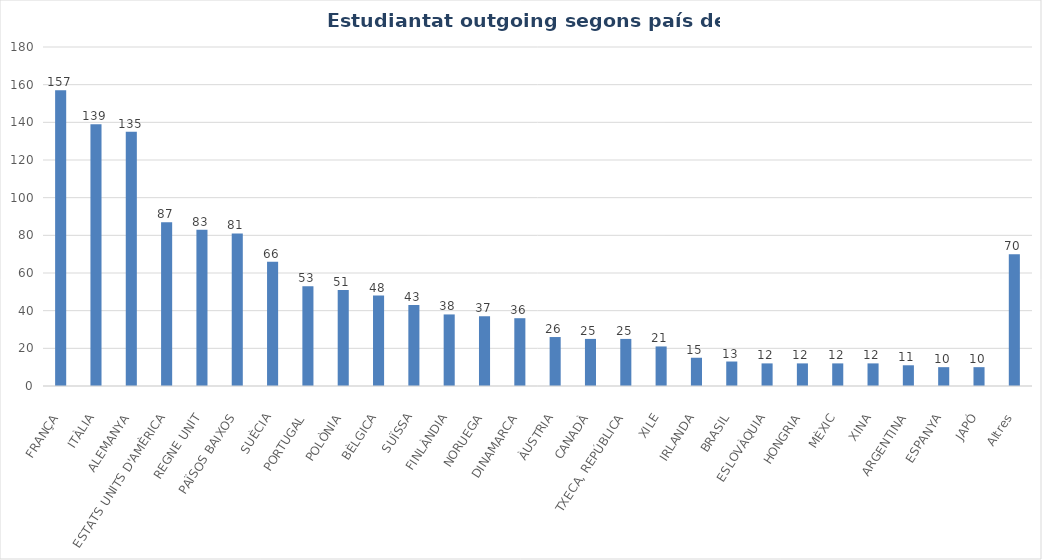
| Category | Series 0 |
|---|---|
| FRANÇA | 157 |
| ITÀLIA | 139 |
| ALEMANYA | 135 |
| ESTATS UNITS D'AMÈRICA | 87 |
| REGNE UNIT | 83 |
| PAÏSOS BAIXOS | 81 |
| SUÈCIA | 66 |
| PORTUGAL | 53 |
| POLÒNIA | 51 |
| BÈLGICA | 48 |
| SUÏSSA | 43 |
| FINLÀNDIA | 38 |
| NORUEGA | 37 |
| DINAMARCA | 36 |
| ÀUSTRIA | 26 |
| CANADÀ | 25 |
| TXECA, REPÚBLICA | 25 |
| XILE | 21 |
| IRLANDA | 15 |
| BRASIL | 13 |
| ESLOVÀQUIA | 12 |
| HONGRIA | 12 |
| MÈXIC | 12 |
| XINA | 12 |
| ARGENTINA | 11 |
| ESPANYA | 10 |
| JAPÓ | 10 |
| Altres | 70 |